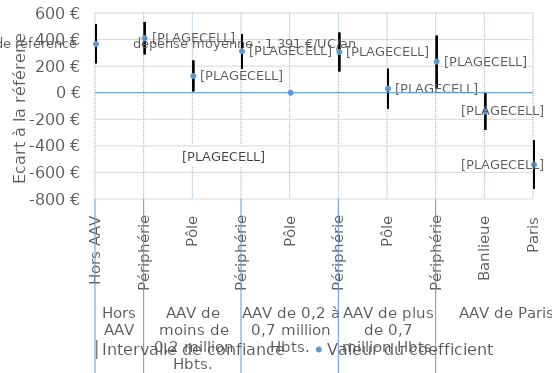
| Category | │Intervalle de confiance | Series 1 | Valeur du coefficient |
|---|---|---|---|
| 0 | 513.097 | 221.135 | 367.116 |
| 1 | 532.715 | 289.168 | 410.942 |
| 2 | 242.032 | 10.736 | 126.384 |
| 3 | 441.847 | 183.056 | 312.452 |
| 4 | 0 | 0 | 0 |
| 5 | 452.616 | 160.762 | 306.689 |
| 6 | 181.23 | -119.181 | 31.024 |
| 7 | 429.49 | 38.952 | 234.221 |
| 8 | -2.798 | -279.742 | -141.27 |
| 9 | -358.632 | -724.718 | -541.675 |